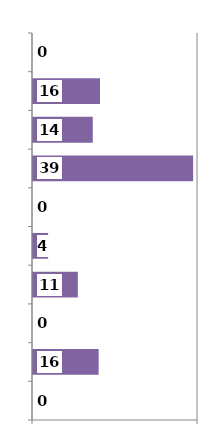
| Category | Series 0 |
|---|---|
| 0 | 0 |
| 1 | 15.916 |
| 2 | 0 |
| 3 | 10.869 |
| 4 | 3.667 |
| 5 | 0 |
| 6 | 38.819 |
| 7 | 14.49 |
| 8 | 16.239 |
| 9 | 0 |